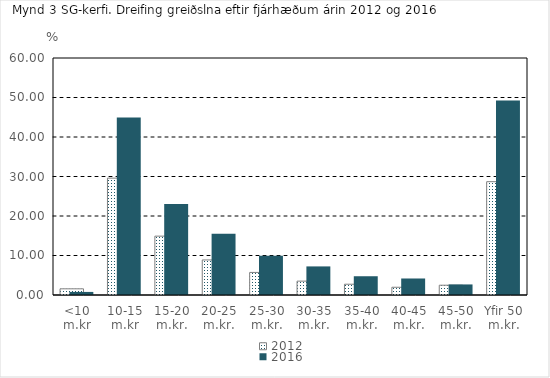
| Category | 2012 | 2016 |
|---|---|---|
| <10 m.kr | 1.565 | 0.779 |
| 10-15 m.kr | 29.583 | 44.924 |
| 15-20 m.kr. | 14.9 | 23.011 |
| 20-25 m.kr. | 8.874 | 15.478 |
| 25-30 m.kr. | 5.712 | 9.927 |
| 30-35 m.kr. | 3.511 | 7.238 |
| 35-40 m.kr. | 2.727 | 4.75 |
| 40-45 m.kr. | 1.962 | 4.18 |
| 45-50 m.kr. | 2.478 | 2.675 |
| Yfir 50 m.kr. | 28.688 | 49.233 |